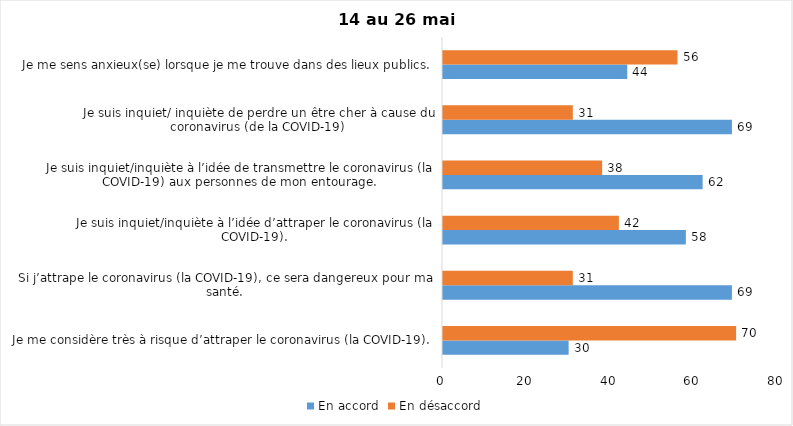
| Category | En accord | En désaccord |
|---|---|---|
| Je me considère très à risque d’attraper le coronavirus (la COVID-19). | 30 | 70 |
| Si j’attrape le coronavirus (la COVID-19), ce sera dangereux pour ma santé. | 69 | 31 |
| Je suis inquiet/inquiète à l’idée d’attraper le coronavirus (la COVID-19). | 58 | 42 |
| Je suis inquiet/inquiète à l’idée de transmettre le coronavirus (la COVID-19) aux personnes de mon entourage. | 62 | 38 |
| Je suis inquiet/ inquiète de perdre un être cher à cause du coronavirus (de la COVID-19) | 69 | 31 |
| Je me sens anxieux(se) lorsque je me trouve dans des lieux publics. | 44 | 56 |